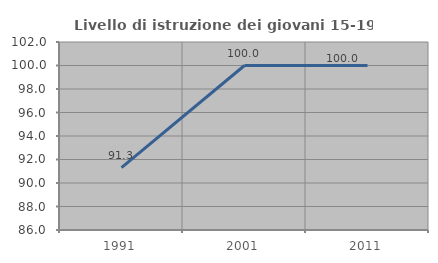
| Category | Livello di istruzione dei giovani 15-19 anni |
|---|---|
| 1991.0 | 91.304 |
| 2001.0 | 100 |
| 2011.0 | 100 |